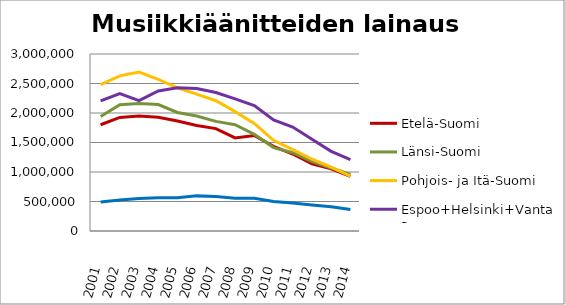
| Category | Etelä-Suomi | Länsi-Suomi | Pohjois- ja Itä-Suomi | Espoo+Helsinki+Vantaa | Muu Uusimaa |
|---|---|---|---|---|---|
| 2001.0 | 1800931 | 1940809 | 2479763 | 2204446 | 491915 |
| 2002.0 | 1925080 | 2141670 | 2629184 | 2327312 | 526972 |
| 2003.0 | 1947312 | 2162236 | 2692857 | 2208664 | 550803 |
| 2004.0 | 1926916 | 2144012 | 2568238 | 2372462 | 561754 |
| 2005.0 | 1864495 | 2009366 | 2425986 | 2427800 | 565515 |
| 2006.0 | 1788864 | 1947692 | 2318985 | 2414680 | 595309 |
| 2007.0 | 1735189 | 1858339 | 2207657 | 2347542 | 583159 |
| 2008.0 | 1576789 | 1800640 | 2023267 | 2239849 | 556826 |
| 2009.0 | 1618331 | 1637758 | 1824190 | 2126291 | 553671 |
| 2010.0 | 1434530 | 1413599 | 1537268 | 1884037 | 499462 |
| 2011.0 | 1304858 | 1327528 | 1379912 | 1761629 | 473144 |
| 2012.0 | 1137568 | 1177181 | 1217756 | 1556691 | 440415 |
| 2013.0 | 1052886 | 1068059 | 1081777 | 1350045 | 409542 |
| 2014.0 | 928158 | 960220 | 930112 | 1208730 | 363349 |